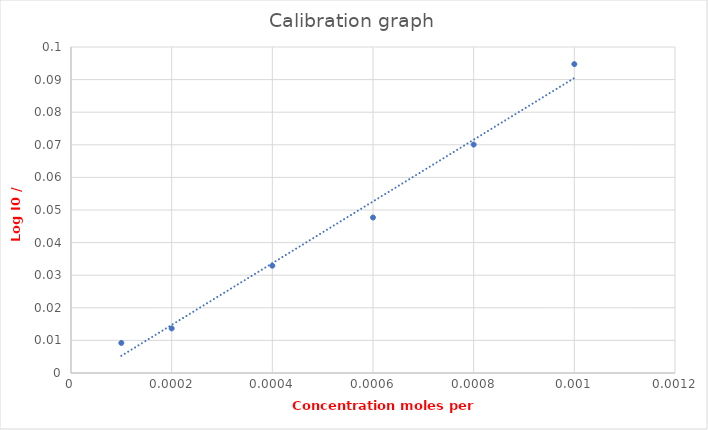
| Category | Series 0 |
|---|---|
| 0.001 | 0.095 |
| 0.0008 | 0.07 |
| 0.0006 | 0.048 |
| 0.0004 | 0.033 |
| 0.0002 | 0.014 |
| 0.0001 | 0.009 |